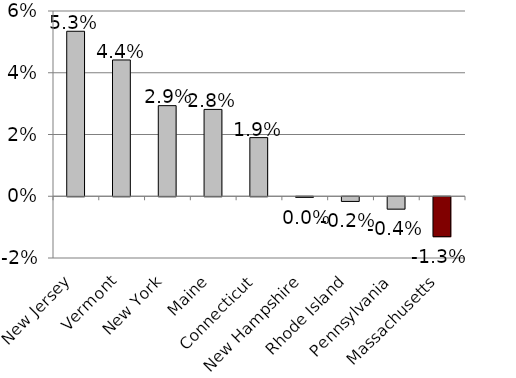
| Category | Series 0 |
|---|---|
| New Jersey | 0.053 |
| Vermont | 0.044 |
| New York | 0.029 |
| Maine | 0.028 |
| Connecticut | 0.019 |
| New Hampshire | 0 |
| Rhode Island | -0.002 |
| Pennsylvania | -0.004 |
| Massachusetts | -0.013 |